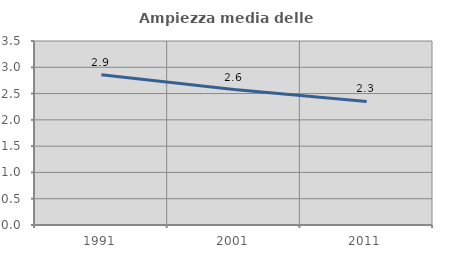
| Category | Ampiezza media delle famiglie |
|---|---|
| 1991.0 | 2.857 |
| 2001.0 | 2.576 |
| 2011.0 | 2.35 |